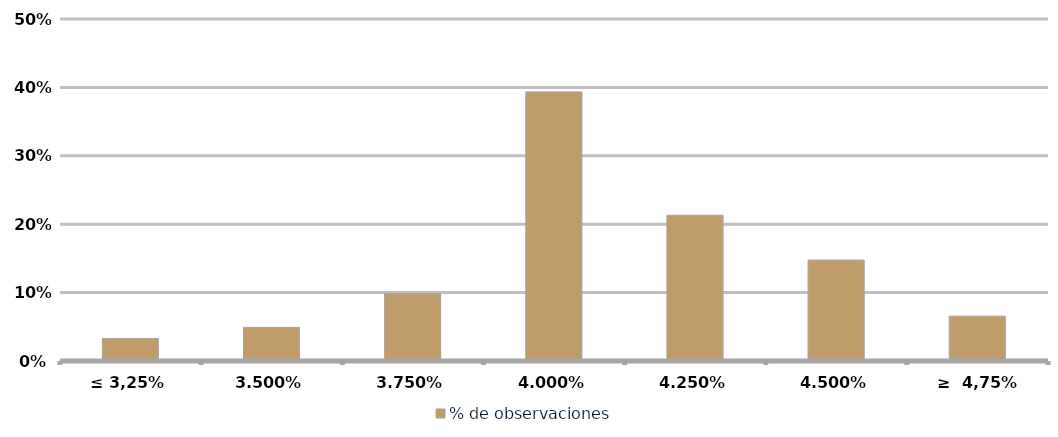
| Category | % de observaciones  |
|---|---|
| ≤ 3,25% | 0.033 |
| 3.50% | 0.049 |
| 3.75% | 0.098 |
| 4.00% | 0.393 |
| 4.25% | 0.213 |
| 4.50% | 0.148 |
| ≥  4,75% | 0.066 |